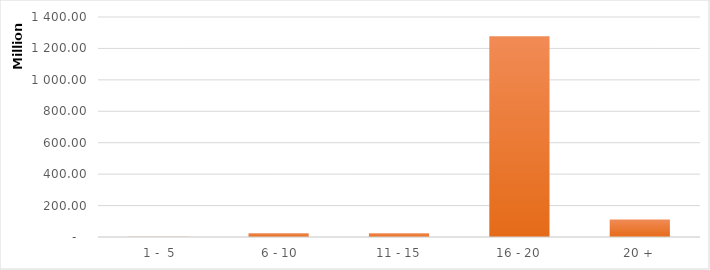
| Category | Series 0 |
|---|---|
|  1 -  5 | 1067054.562 |
|  6 - 10 | 24531165.932 |
| 11 - 15 | 23873218.607 |
| 16 - 20 | 1277676507.742 |
| 20 + | 112006346.947 |